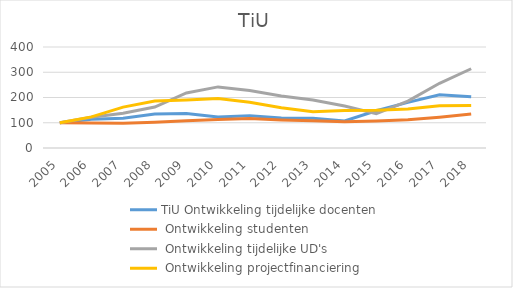
| Category | TiU Ontwikkeling tijdelijke docenten | TiU Ontwikkeling studenten | TiU Ontwikkeling tijdelijke UD's | TiU Ontwikkeling projectfinanciering |
|---|---|---|---|---|
| 2005.0 | 100 | 100 | 100 | 100 |
| 2006.0 | 114.035 | 98.945 | 122 | 123.185 |
| 2007.0 | 117.544 | 98.439 | 138 | 161.965 |
| 2008.0 | 135.088 | 102.059 | 162 | 185.827 |
| 2009.0 | 136.842 | 108.175 | 218 | 189.645 |
| 2010.0 | 122.807 | 112.799 | 242 | 196.124 |
| 2011.0 | 128.07 | 116.557 | 228 | 180.892 |
| 2012.0 | 119.298 | 111.126 | 206 | 159.14 |
| 2013.0 | 117.544 | 107.995 | 190 | 143.701 |
| 2014.0 | 107.018 | 103.989 | 166 | 148.983 |
| 2015.0 | 147.368 | 106.666 | 136 | 149.272 |
| 2016.0 | 180.702 | 111.89 | 186 | 154.27 |
| 2017.0 | 211.158 | 122.193 | 256.3 | 166.889 |
| 2018.0 | 202.632 | 134.949 | 313.88 | 168.084 |